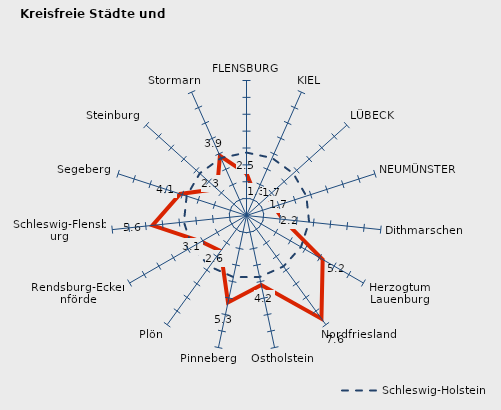
| Category | Kreise | Schleswig-Holstein |
|---|---|---|
| FLENSBURG | 2.485 | 3.729 |
| KIEL | 1.291 | 3.729 |
| LÜBECK | 1.715 | 3.729 |
| NEUMÜNSTER | 1.714 | 3.729 |
| Dithmarschen | 2.166 | 3.729 |
| Herzogtum Lauenburg | 5.212 | 3.729 |
| Nordfriesland | 7.555 | 3.729 |
| Ostholstein | 4.208 | 3.729 |
| Pinneberg | 5.271 | 3.729 |
| Plön | 2.6 | 3.729 |
| Rendsburg-Eckernförde | 3.091 | 3.729 |
| Schleswig-Flensburg | 5.599 | 3.729 |
| Segeberg | 4.135 | 3.729 |
| Steinburg | 2.348 | 3.729 |
| Stormarn | 3.868 | 3.729 |